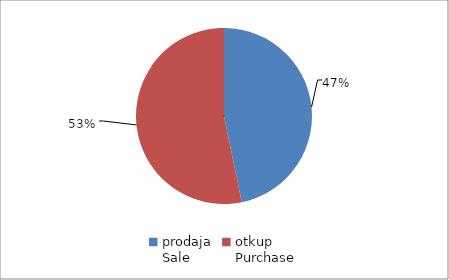
| Category | Series 0 |
|---|---|
| prodaja
Sale | 137271183.96 |
| otkup
Purchase | 156297199.54 |